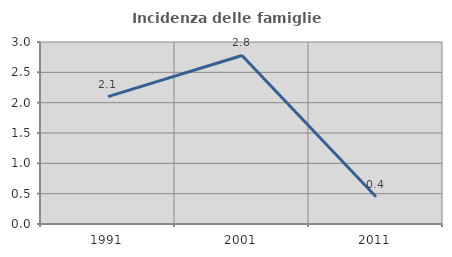
| Category | Incidenza delle famiglie numerose |
|---|---|
| 1991.0 | 2.1 |
| 2001.0 | 2.778 |
| 2011.0 | 0.448 |